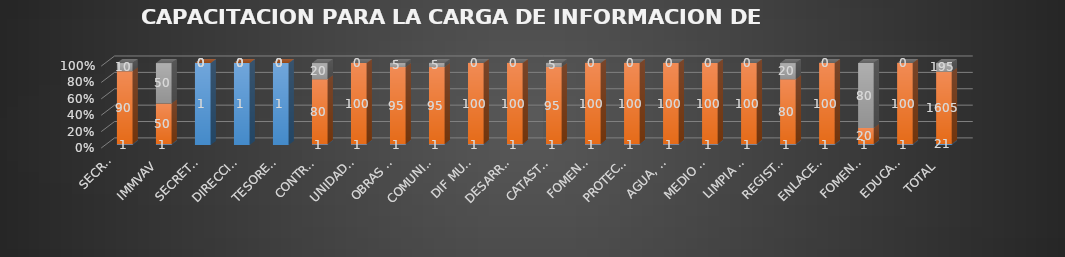
| Category | Series 0 | Series 1 | Series 2 |
|---|---|---|---|
| SECRETARIA EJECUTIVA
SIPINNA | 1 | 90 | 10 |
| IMMVAV | 1 | 50 | 50 |
| SECRETARIA DEL H.AYUNTAMIENTO | 1 | 0 | 0 |
| DIRECCION JURIDICA | 1 | 0 | 0 |
| TESORERIA  | 1 | 0 | 0 |
| CONTRALORIA | 1 | 80 | 20 |
| UNIDAD DE TRANSPARENCIA | 1 | 100 | 0 |
| OBRAS PUBLICAS | 1 | 95 | 5 |
| COMUNICACIÓN SOCIAL | 1 | 95 | 5 |
| DIF MUNICIAPL | 1 | 100 | 0 |
| DESARROLLO-SOCIAL | 1 | 100 | 0 |
| CATASTRO | 1 | 95 | 5 |
| FOMENTO AGROPECUARIO | 1 | 100 | 0 |
| PROTECCION CIVIL | 1 | 100 | 0 |
| AGUA, DRENAJE Y ALCANTARILLADO | 1 | 100 | 0 |
| MEDIO AMBIENTE | 1 | 100 | 0 |
| LIMPIA PUBLICA | 1 | 100 | 0 |
| REGISTRO CIVIL | 1 | 80 | 20 |
| ENLACE MUNICIPAL | 1 | 100 | 0 |
| FOMENTO DEPORTIVO | 1 | 20 | 80 |
| EDUCACION, CULTURA Y DEPORTE | 1 | 100 | 0 |
| TOTAL | 21 | 1605 | 195 |